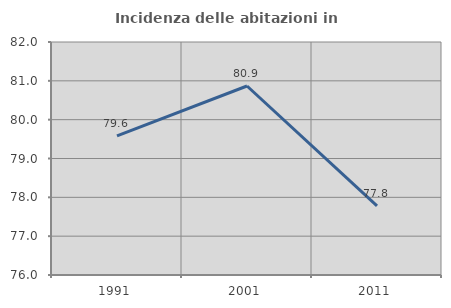
| Category | Incidenza delle abitazioni in proprietà  |
|---|---|
| 1991.0 | 79.585 |
| 2001.0 | 80.867 |
| 2011.0 | 77.778 |